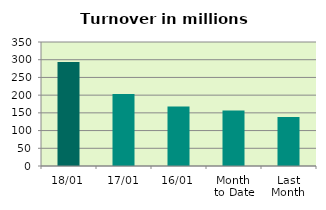
| Category | Series 0 |
|---|---|
| 18/01 | 293.298 |
| 17/01 | 203.421 |
| 16/01 | 168.08 |
| Month 
to Date | 156.97 |
| Last
Month | 138.201 |